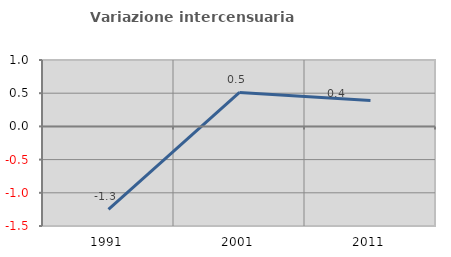
| Category | Variazione intercensuaria annua |
|---|---|
| 1991.0 | -1.251 |
| 2001.0 | 0.512 |
| 2011.0 | 0.388 |